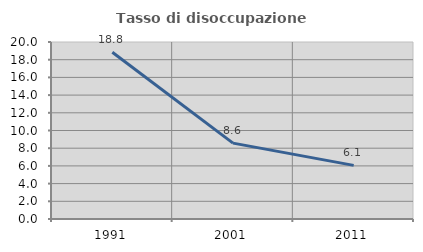
| Category | Tasso di disoccupazione giovanile  |
|---|---|
| 1991.0 | 18.841 |
| 2001.0 | 8.571 |
| 2011.0 | 6.061 |